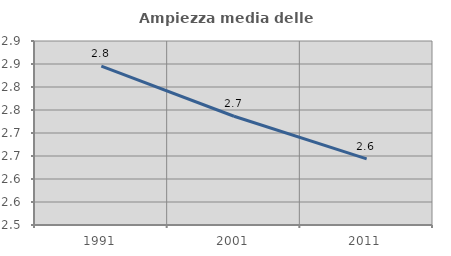
| Category | Ampiezza media delle famiglie |
|---|---|
| 1991.0 | 2.846 |
| 2001.0 | 2.736 |
| 2011.0 | 2.644 |